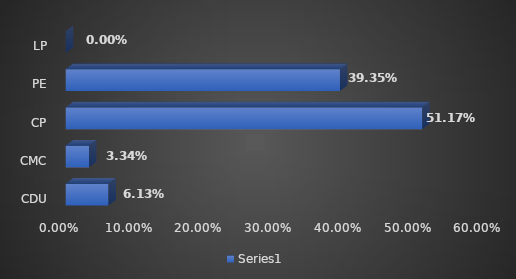
| Category | Series 0 |
|---|---|
| CDU | 0.061 |
| CMC | 0.033 |
| CP | 0.512 |
| PE | 0.394 |
| LP | 0 |